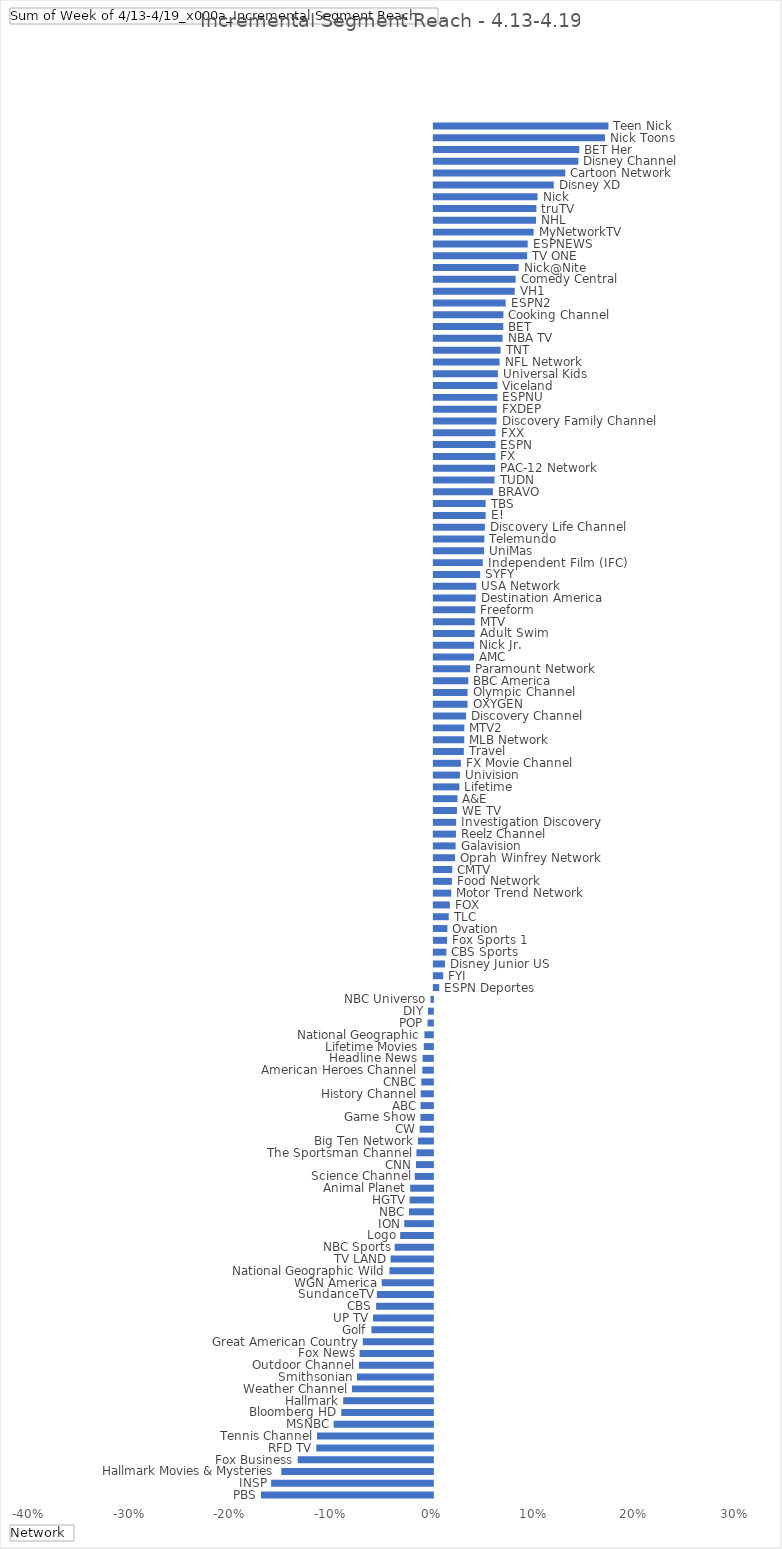
| Category | Total |
|---|---|
| PBS | -0.171 |
| INSP | -0.161 |
| Hallmark Movies & Mysteries | -0.15 |
| Fox Business | -0.134 |
| RFD TV | -0.116 |
| Tennis Channel | -0.115 |
| MSNBC | -0.099 |
| Bloomberg HD | -0.091 |
| Hallmark | -0.089 |
| Weather Channel | -0.08 |
| Smithsonian | -0.075 |
| Outdoor Channel | -0.073 |
| Fox News | -0.073 |
| Great American Country | -0.07 |
| Golf | -0.061 |
| UP TV | -0.059 |
| CBS | -0.056 |
| SundanceTV | -0.056 |
| WGN America | -0.051 |
| National Geographic Wild | -0.043 |
| TV LAND | -0.042 |
| NBC Sports | -0.038 |
| Logo | -0.032 |
| ION | -0.028 |
| NBC | -0.024 |
| HGTV | -0.023 |
| Animal Planet | -0.023 |
| Science Channel | -0.018 |
| CNN | -0.017 |
| The Sportsman Channel | -0.016 |
| Big Ten Network | -0.015 |
| CW | -0.013 |
| Game Show | -0.012 |
| ABC | -0.012 |
| History Channel | -0.012 |
| CNBC | -0.011 |
| American Heroes Channel | -0.01 |
| Headline News | -0.01 |
| Lifetime Movies | -0.009 |
| National Geographic | -0.008 |
| POP | -0.005 |
| DIY | -0.005 |
| NBC Universo | -0.002 |
| ESPN Deportes | 0.005 |
| FYI | 0.009 |
| Disney Junior US | 0.011 |
| CBS Sports | 0.012 |
| Fox Sports 1 | 0.013 |
| Ovation | 0.013 |
| TLC | 0.015 |
| FOX | 0.016 |
| Motor Trend Network | 0.017 |
| Food Network | 0.018 |
| CMTV | 0.018 |
| Oprah Winfrey Network | 0.021 |
| Galavision | 0.022 |
| Reelz Channel | 0.022 |
| Investigation Discovery | 0.022 |
| WE TV | 0.023 |
| A&E | 0.023 |
| Lifetime | 0.025 |
| Univision | 0.026 |
| FX Movie Channel | 0.027 |
| Travel | 0.03 |
| MLB Network | 0.03 |
| MTV2 | 0.03 |
| Discovery Channel | 0.032 |
| OXYGEN | 0.033 |
| Olympic Channel | 0.033 |
| BBC America | 0.034 |
| Paramount Network | 0.036 |
| AMC | 0.04 |
| Nick Jr. | 0.04 |
| Adult Swim | 0.041 |
| MTV | 0.041 |
| Freeform | 0.041 |
| Destination America | 0.042 |
| USA Network | 0.042 |
| SYFY | 0.046 |
| Independent Film (IFC) | 0.049 |
| UniMas | 0.05 |
| Telemundo | 0.05 |
| Discovery Life Channel | 0.051 |
| E! | 0.051 |
| TBS | 0.051 |
| BRAVO | 0.059 |
| TUDN | 0.06 |
| PAC-12 Network | 0.061 |
| FX | 0.061 |
| ESPN | 0.061 |
| FXX | 0.061 |
| Discovery Family Channel | 0.062 |
| FXDEP | 0.062 |
| ESPNU | 0.063 |
| Viceland | 0.063 |
| Universal Kids | 0.064 |
| NFL Network | 0.065 |
| TNT | 0.066 |
| NBA TV | 0.068 |
| BET | 0.069 |
| Cooking Channel | 0.069 |
| ESPN2 | 0.071 |
| VH1 | 0.08 |
| Comedy Central | 0.081 |
| Nick@Nite | 0.084 |
| TV ONE | 0.093 |
| ESPNEWS | 0.093 |
| MyNetworkTV | 0.099 |
| NHL | 0.101 |
| truTV | 0.102 |
| Nick | 0.103 |
| Disney XD | 0.119 |
| Cartoon Network | 0.13 |
| Disney Channel | 0.143 |
| BET Her | 0.144 |
| Nick Toons | 0.17 |
| Teen Nick | 0.173 |